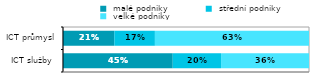
| Category |  malé podniky |  střední podniky |  velké podniky  |
|---|---|---|---|
|   ICT služby  | 0.446 | 0.196 | 0.358 |
|   ICT průmysl | 0.209 | 0.165 | 0.626 |